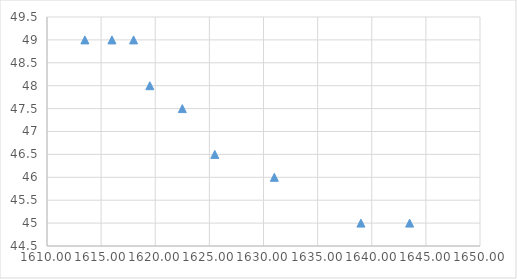
| Category | Series 0 |
|---|---|
| 1613.5 | 49 |
| 1616.0 | 49 |
| 1618.0 | 49 |
| 1619.5 | 48 |
| 1622.5 | 47.5 |
| 1625.5 | 46.5 |
| 1631.0 | 46 |
| 1639.0 | 45 |
| 1643.5 | 45 |